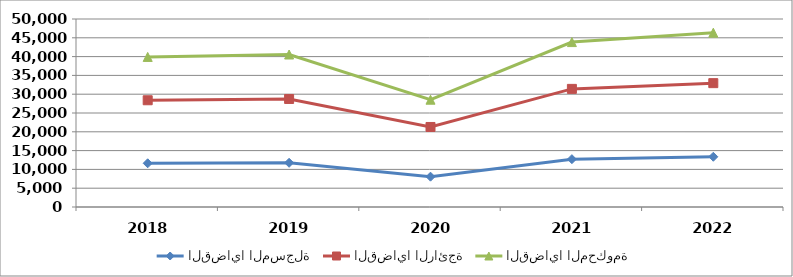
| Category | القضايا المسجلة | القضايا الرائجة | القضايا المحكومة |
|---|---|---|---|
| 2018.0 | 11626 | 16764 | 11522 |
| 2019.0 | 11757 | 16977 | 11822 |
| 2020.0 | 8064 | 13219 | 7255 |
| 2021.0 | 12725 | 18689 | 12447 |
| 2022.0 | 13363 | 19576 | 13414 |